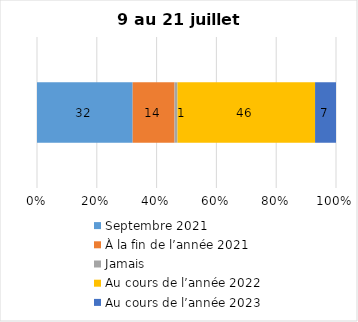
| Category | Septembre 2021 | À la fin de l’année 2021 | Jamais | Au cours de l’année 2022 | Au cours de l’année 2023 |
|---|---|---|---|---|---|
| 0 | 32 | 14 | 1 | 46 | 7 |